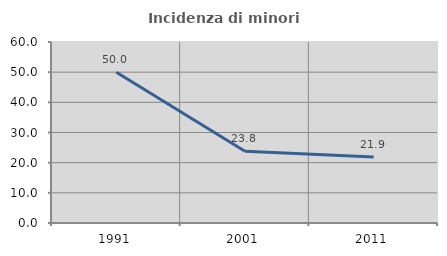
| Category | Incidenza di minori stranieri |
|---|---|
| 1991.0 | 50 |
| 2001.0 | 23.81 |
| 2011.0 | 21.91 |